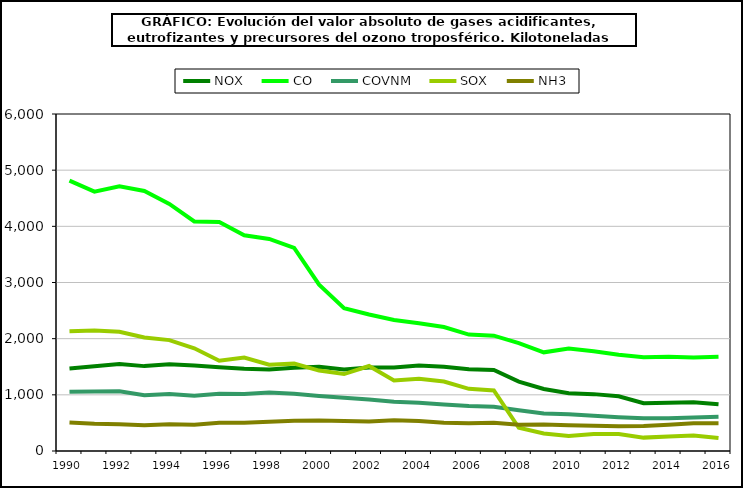
| Category | NOX | CO | COVNM | SOX | NH3 |
|---|---|---|---|---|---|
| 1990.0 | 1468.409 | 4813.462 | 1053.34 | 2131.014 | 506.593 |
| 1991.0 | 1506.845 | 4617.628 | 1058.854 | 2145.659 | 484.304 |
| 1992.0 | 1550.262 | 4715.02 | 1062.581 | 2121.688 | 478.339 |
| 1993.0 | 1511.241 | 4628.699 | 993.629 | 2020.993 | 459.286 |
| 1994.0 | 1543.328 | 4400.206 | 1013.597 | 1974.58 | 478.049 |
| 1995.0 | 1521.285 | 4086.866 | 985.182 | 1829.58 | 469.338 |
| 1996.0 | 1491.961 | 4078.05 | 1018.136 | 1606.112 | 501.719 |
| 1997.0 | 1463.913 | 3842.067 | 1015.737 | 1663.041 | 503.426 |
| 1998.0 | 1450.175 | 3776.285 | 1040.002 | 1536.119 | 521.915 |
| 1999.0 | 1480.846 | 3615.355 | 1018.118 | 1555.58 | 538.337 |
| 2000.0 | 1498.294 | 2962.908 | 980.343 | 1432.03 | 543.719 |
| 2001.0 | 1451.556 | 2544.35 | 947.006 | 1370.091 | 531.99 |
| 2002.0 | 1486.241 | 2429.954 | 916.843 | 1513.201 | 525.037 |
| 2003.0 | 1484.607 | 2331.633 | 876.366 | 1257.164 | 545.637 |
| 2004.0 | 1521.137 | 2273.661 | 858.582 | 1284.222 | 535.577 |
| 2005.0 | 1499.655 | 2206.463 | 829.008 | 1238.102 | 503.418 |
| 2006.0 | 1454.091 | 2072.577 | 801.942 | 1106.33 | 493.17 |
| 2007.0 | 1443.075 | 2053.877 | 789.158 | 1077.421 | 502.839 |
| 2008.0 | 1235.883 | 1920.297 | 727.262 | 412.675 | 465.714 |
| 2009.0 | 1104.541 | 1756.631 | 667.563 | 312.295 | 470.319 |
| 2010.0 | 1029.006 | 1825.329 | 655.215 | 266.124 | 458.449 |
| 2011.0 | 1012.56 | 1777.489 | 627.43 | 301.664 | 449.192 |
| 2012.0 | 975.449 | 1713.383 | 601.699 | 300.477 | 441.543 |
| 2013.0 | 851.773 | 1668.237 | 581.782 | 238.204 | 445.431 |
| 2014.0 | 857.939 | 1677.606 | 581.077 | 259.816 | 466.378 |
| 2015.0 | 868.732 | 1663.688 | 596.783 | 277.456 | 494.14 |
| 2016.0 | 832.647 | 1676.002 | 607.895 | 229.887 | 494.805 |